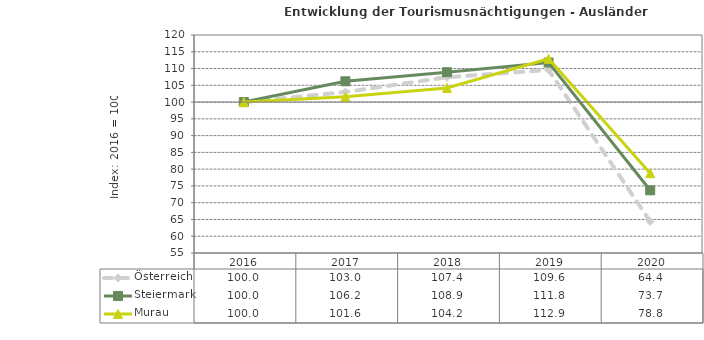
| Category | Österreich | Steiermark | Murau |
|---|---|---|---|
| 2020.0 | 64.4 | 73.7 | 78.8 |
| 2019.0 | 109.6 | 111.8 | 112.9 |
| 2018.0 | 107.4 | 108.9 | 104.2 |
| 2017.0 | 103 | 106.2 | 101.6 |
| 2016.0 | 100 | 100 | 100 |